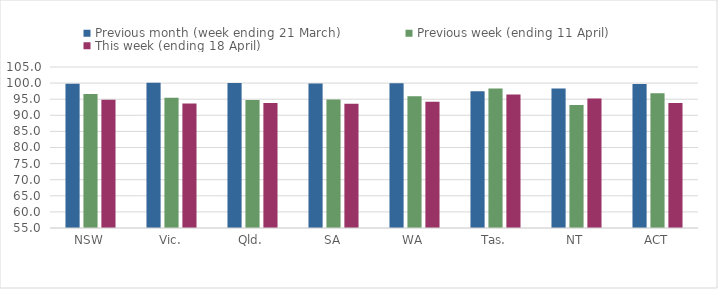
| Category | Previous month (week ending 21 March) | Previous week (ending 11 April) | This week (ending 18 April) |
|---|---|---|---|
| NSW | 99.762 | 96.605 | 94.836 |
| Vic. | 100.115 | 95.423 | 93.635 |
| Qld. | 100.021 | 94.742 | 93.857 |
| SA | 99.886 | 94.907 | 93.61 |
| WA | 99.971 | 95.929 | 94.195 |
| Tas. | 97.469 | 98.331 | 96.441 |
| NT | 98.297 | 93.187 | 95.243 |
| ACT | 99.758 | 96.848 | 93.8 |